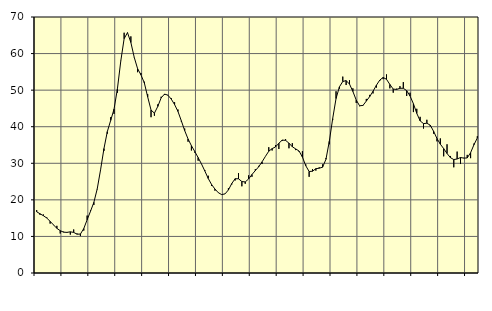
| Category | Piggar | Series 1 |
|---|---|---|
| nan | 17.2 | 16.74 |
| 87.0 | 15.9 | 16.19 |
| 87.0 | 16 | 15.67 |
| 87.0 | 15.2 | 15.03 |
| nan | 13.5 | 14.12 |
| 88.0 | 13.1 | 13.16 |
| 88.0 | 12.9 | 12.21 |
| 88.0 | 10.8 | 11.57 |
| nan | 11.3 | 11.16 |
| 89.0 | 11.2 | 11.11 |
| 89.0 | 10.5 | 11.26 |
| 89.0 | 11.9 | 11.1 |
| nan | 10.8 | 10.61 |
| 90.0 | 10.1 | 10.65 |
| 90.0 | 11.6 | 12.15 |
| 90.0 | 15.7 | 14.55 |
| nan | 17.1 | 16.88 |
| 91.0 | 18.6 | 19.32 |
| 91.0 | 22.9 | 23 |
| 91.0 | 28.3 | 28.25 |
| nan | 33.4 | 34.02 |
| 92.0 | 38.1 | 38.66 |
| 92.0 | 42.6 | 41.72 |
| 92.0 | 43.5 | 44.8 |
| nan | 49.3 | 50.37 |
| 93.0 | 58 | 57.94 |
| 93.0 | 65.7 | 64.07 |
| 93.0 | 65.6 | 65.72 |
| nan | 64.7 | 63.04 |
| 94.0 | 58.9 | 58.97 |
| 94.0 | 54.9 | 55.88 |
| 94.0 | 54.7 | 54.17 |
| nan | 52.3 | 52 |
| 95.0 | 48.9 | 48.16 |
| 95.0 | 42.6 | 44.56 |
| 95.0 | 43 | 43.71 |
| nan | 46.1 | 45.54 |
| 96.0 | 48.2 | 47.88 |
| 96.0 | 48.7 | 48.92 |
| 96.0 | 48.7 | 48.63 |
| nan | 47.8 | 47.56 |
| 97.0 | 46.7 | 46.06 |
| 97.0 | 44.7 | 44.18 |
| 97.0 | 41.4 | 41.62 |
| nan | 39.5 | 38.94 |
| 98.0 | 35.9 | 36.66 |
| 98.0 | 33.5 | 34.81 |
| 98.0 | 32.9 | 33.23 |
| nan | 30.7 | 31.56 |
| 99.0 | 29.8 | 29.81 |
| 99.0 | 28.1 | 27.87 |
| 99.0 | 26.6 | 25.85 |
| nan | 23.8 | 24.19 |
| 0.0 | 22.5 | 22.96 |
| 0.0 | 22 | 21.96 |
| 0.0 | 21.4 | 21.44 |
| nan | 21.6 | 21.63 |
| 1.0 | 23.2 | 22.71 |
| 1.0 | 24.2 | 24.47 |
| 1.0 | 25.3 | 25.78 |
| nan | 27.3 | 25.76 |
| 2.0 | 23.7 | 25.01 |
| 2.0 | 24.4 | 24.9 |
| 2.0 | 26.7 | 25.7 |
| nan | 26.3 | 26.93 |
| 3.0 | 28.4 | 28 |
| 3.0 | 29.3 | 29.04 |
| 3.0 | 29.8 | 30.39 |
| nan | 31.9 | 31.88 |
| 4.0 | 34.4 | 33.3 |
| 4.0 | 33.5 | 34.01 |
| 4.0 | 35 | 34.47 |
| nan | 33.9 | 35.48 |
| 5.0 | 36.1 | 36.34 |
| 5.0 | 36.6 | 36.27 |
| 5.0 | 34.1 | 35.5 |
| nan | 35.5 | 34.52 |
| 6.0 | 33.6 | 33.93 |
| 6.0 | 33.2 | 33.36 |
| 6.0 | 33.3 | 31.71 |
| nan | 29.7 | 29.33 |
| 7.0 | 26.3 | 27.75 |
| 7.0 | 28.4 | 27.83 |
| 7.0 | 28 | 28.53 |
| nan | 28.9 | 28.65 |
| 8.0 | 29.7 | 28.93 |
| 8.0 | 31.4 | 31.1 |
| 8.0 | 35.2 | 36.01 |
| nan | 41.8 | 42.21 |
| 9.0 | 49.7 | 47.71 |
| 9.0 | 50.4 | 50.9 |
| 9.0 | 53.7 | 52.36 |
| nan | 51.4 | 52.61 |
| 10.0 | 52.7 | 51.65 |
| 10.0 | 50.5 | 49.65 |
| 10.0 | 46.5 | 47.29 |
| nan | 45.6 | 45.73 |
| 11.0 | 45.7 | 45.82 |
| 11.0 | 47.6 | 47.01 |
| 11.0 | 48.7 | 48.24 |
| nan | 49.1 | 49.69 |
| 12.0 | 50.7 | 51.35 |
| 12.0 | 52.5 | 52.75 |
| 12.0 | 53 | 53.47 |
| nan | 54.3 | 52.96 |
| 13.0 | 50.5 | 51.56 |
| 13.0 | 49.3 | 50.29 |
| 13.0 | 50.4 | 50.19 |
| nan | 51.1 | 50.51 |
| 14.0 | 52.2 | 50.51 |
| 14.0 | 48.4 | 49.86 |
| 14.0 | 49.3 | 48.4 |
| nan | 44 | 46.28 |
| 15.0 | 44.9 | 43.66 |
| 15.0 | 42.7 | 41.6 |
| 15.0 | 39.5 | 40.85 |
| nan | 41.9 | 40.96 |
| 16.0 | 40.1 | 40.42 |
| 16.0 | 38.1 | 38.76 |
| 16.0 | 36 | 36.78 |
| nan | 36.8 | 35.23 |
| 17.0 | 31.9 | 34.02 |
| 17.0 | 35.2 | 32.68 |
| 17.0 | 32 | 31.54 |
| nan | 28.9 | 31.02 |
| 18.0 | 33.2 | 31.17 |
| 18.0 | 29.8 | 31.58 |
| 18.0 | 31.5 | 31.41 |
| nan | 32.3 | 31.46 |
| 19.0 | 31.4 | 32.89 |
| 19.0 | 35.4 | 35.07 |
| 19.0 | 37.4 | 36.92 |